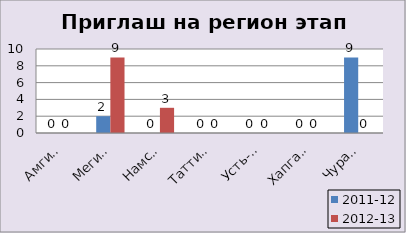
| Category | 2011-12 | 2012-13 |
|---|---|---|
| Амгинский | 0 | 0 |
| Мегино-Кангаласс | 2 | 9 |
| Намский | 0 | 3 |
| Таттинский | 0 | 0 |
| Усть-Алданский | 0 | 0 |
| Хапгаласский | 0 | 0 |
| Чурапчинский | 9 | 0 |